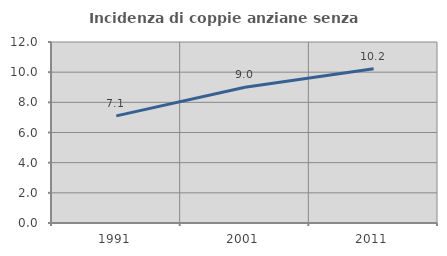
| Category | Incidenza di coppie anziane senza figli  |
|---|---|
| 1991.0 | 7.104 |
| 2001.0 | 9.005 |
| 2011.0 | 10.227 |